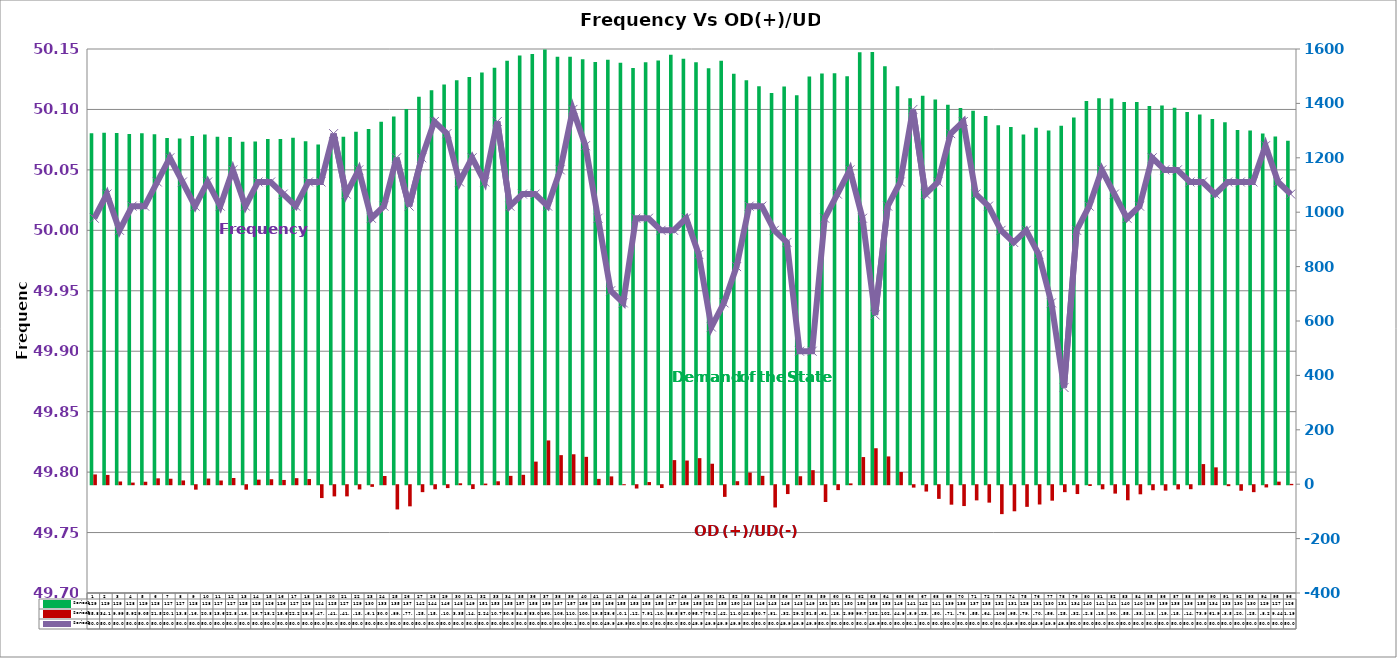
| Category | Series 2 | Series 4 |
|---|---|---|
| 0 | 1290.7 | 35.86 |
| 1 | 1291.8 | 34.14 |
| 2 | 1291 | 9.99 |
| 3 | 1287.34 | 5.92 |
| 4 | 1290.4 | 9.05 |
| 5 | 1286.59 | 21.57 |
| 6 | 1272.36 | 20.11 |
| 7 | 1270.55 | 13.82 |
| 8 | 1280.46 | -16.4 |
| 9 | 1285.52 | 20.82 |
| 10 | 1277.09 | 13.62 |
| 11 | 1276.72 | 22.8 |
| 12 | 1258.82 | -16.54 |
| 13 | 1259.49 | 16.77 |
| 14 | 1269.42 | 18.27 |
| 15 | 1268.88 | 15.62 |
| 16 | 1274.02 | 22.21 |
| 17 | 1260.41 | 18.97 |
| 18 | 1248.9 | -47.28 |
| 19 | 1257 | -41.16 |
| 20 | 1277.51 | -41.06 |
| 21 | 1295.73 | -15.56 |
| 22 | 1306.3 | -6.12 |
| 23 | 1332.46 | 30.09 |
| 24 | 1352.17 | -89.11 |
| 25 | 1379.07 | -77.72 |
| 26 | 1424.23 | -25.54 |
| 27 | 1448.01 | -15.04 |
| 28 | 1469.45 | -10.63 |
| 29 | 1485.35 | 3.35 |
| 30 | 1496.66 | -14.19 |
| 31 | 1513.78 | 2.24 |
| 32 | 1531.25 | 10.72 |
| 33 | 1556.61 | 30.61 |
| 34 | 1575.69 | 34.55 |
| 35 | 1581.39 | 83.07 |
| 36 | 1598.38 | 160.89 |
| 37 | 1571.8 | 106.82 |
| 38 | 1571.53 | 110.04 |
| 39 | 1562.05 | 100.59 |
| 40 | 1551.82 | 19.57 |
| 41 | 1560.44 | 28.68 |
| 42 | 1549.53 | -0.11 |
| 43 | 1530.46 | -12.2 |
| 44 | 1551.59 | 7.91 |
| 45 | 1557.48 | -10.27 |
| 46 | 1579.18 | 88.57 |
| 47 | 1564.06 | 87 |
| 48 | 1551.6 | 95.77 |
| 49 | 1529.42 | 75.24 |
| 50 | 1556.64 | -42.92 |
| 51 | 1508.82 | 11.03 |
| 52 | 1484.98 | 42.81 |
| 53 | 1462.66 | 30.74 |
| 54 | 1438.32 | -81.88 |
| 55 | 1462.05 | -32.57 |
| 56 | 1430.27 | 29.27 |
| 57 | 1498.96 | 51.56 |
| 58 | 1510.32 | -61.77 |
| 59 | 1510.93 | -18.09 |
| 60 | 1499.83 | 2.99 |
| 61 | 1588.22 | 99.76 |
| 62 | 1588.56 | 132.21 |
| 63 | 1536.97 | 102.1 |
| 64 | 1463.49 | 44.98 |
| 65 | 1419.39 | -8.9 |
| 66 | 1427.85 | -23.37 |
| 67 | 1414.48 | -50.27 |
| 68 | 1394.98 | -71.59 |
| 69 | 1383.41 | -76.66 |
| 70 | 1372.71 | -55.82 |
| 71 | 1353.45 | -64.1 |
| 72 | 1319.89 | -106.36 |
| 73 | 1313.57 | -95.9 |
| 74 | 1285.58 | -79.6 |
| 75 | 1310.43 | -70.92 |
| 76 | 1300.43 | -56.87 |
| 77 | 1317.85 | -25.59 |
| 78 | 1348.43 | -32.54 |
| 79 | 1408.59 | -2.85 |
| 80 | 1418.72 | -15.1 |
| 81 | 1418.43 | -30.9 |
| 82 | 1405.14 | -55.45 |
| 83 | 1404.84 | -33.48 |
| 84 | 1390.28 | -18.53 |
| 85 | 1392.01 | -19.98 |
| 86 | 1383.89 | -15.45 |
| 87 | 1368.84 | -14.7 |
| 88 | 1359.2 | 73.93 |
| 89 | 1342.42 | 61.96 |
| 90 | 1330.26 | -3.55 |
| 91 | 1302.64 | -20.33 |
| 92 | 1300.06 | -25.59 |
| 93 | 1289.71 | -8.23 |
| 94 | 1278.11 | 9.44 |
| 95 | 1263.04 | 1.19 |